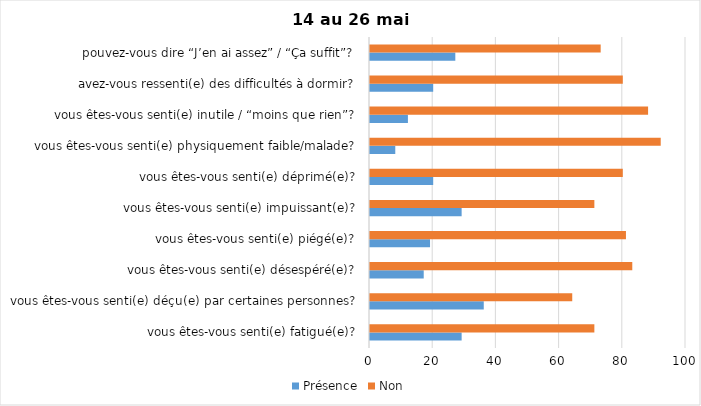
| Category | Présence | Non |
|---|---|---|
| vous êtes-vous senti(e) fatigué(e)? | 29 | 71 |
| vous êtes-vous senti(e) déçu(e) par certaines personnes? | 36 | 64 |
| vous êtes-vous senti(e) désespéré(e)? | 17 | 83 |
| vous êtes-vous senti(e) piégé(e)? | 19 | 81 |
| vous êtes-vous senti(e) impuissant(e)? | 29 | 71 |
| vous êtes-vous senti(e) déprimé(e)? | 20 | 80 |
| vous êtes-vous senti(e) physiquement faible/malade? | 8 | 92 |
| vous êtes-vous senti(e) inutile / “moins que rien”? | 12 | 88 |
| avez-vous ressenti(e) des difficultés à dormir? | 20 | 80 |
| pouvez-vous dire “J’en ai assez” / “Ça suffit”? | 27 | 73 |